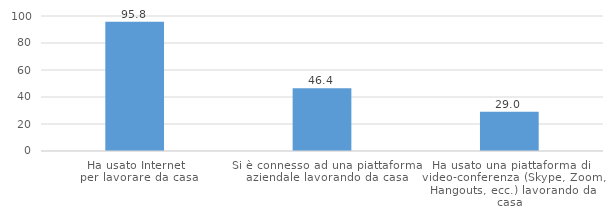
| Category | Totale |
|---|---|
| Ha usato Internet 
per lavorare da casa | 95.8 |
| Si è connesso ad una piattaforma aziendale lavorando da casa | 46.4 |
| Ha usato una piattaforma di 
video-conferenza (Skype, Zoom, Hangouts, ecc.) lavorando da casa | 29 |